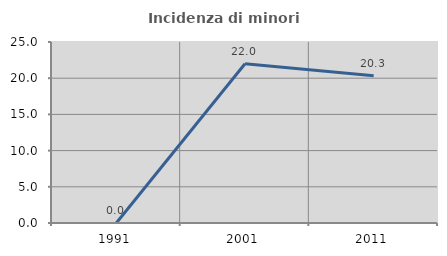
| Category | Incidenza di minori stranieri |
|---|---|
| 1991.0 | 0 |
| 2001.0 | 22 |
| 2011.0 | 20.339 |